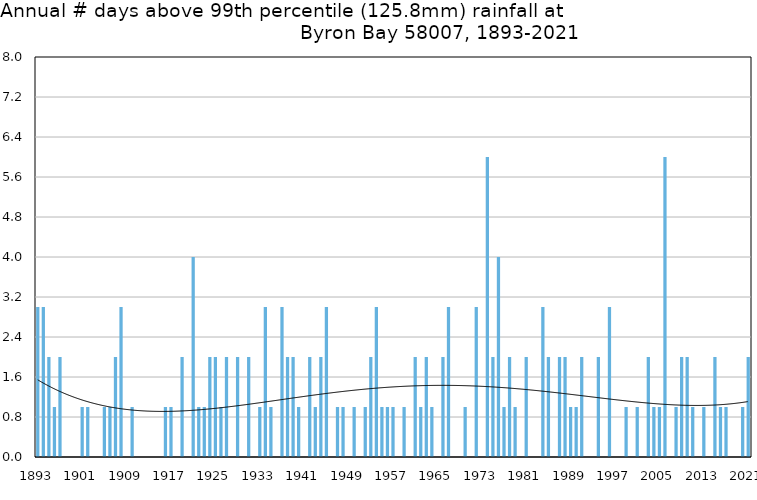
| Category | Annual # days above 99th percentile |
|---|---|
| 1893 | 3 |
| 1894 | 3 |
| 1895 | 2 |
| 1896 | 1 |
| 1897 | 2 |
| 1898 | 0 |
| 1899 | 0 |
| 1900 | 0 |
| 1901 | 1 |
| 1902 | 1 |
| 1903 | 0 |
| 1904 | 0 |
| 1905 | 1 |
| 1906 | 1 |
| 1907 | 2 |
| 1908 | 3 |
| 1909 | 0 |
| 1910 | 1 |
| 1911 | 0 |
| 1912 | 0 |
| 1913 | 0 |
| 1914 | 0 |
| 1915 | 0 |
| 1916 | 1 |
| 1917 | 1 |
| 1918 | 0 |
| 1919 | 2 |
| 1920 | 0 |
| 1921 | 4 |
| 1922 | 1 |
| 1923 | 1 |
| 1924 | 2 |
| 1925 | 2 |
| 1926 | 1 |
| 1927 | 2 |
| 1928 | 0 |
| 1929 | 2 |
| 1930 | 0 |
| 1931 | 2 |
| 1932 | 0 |
| 1933 | 1 |
| 1934 | 3 |
| 1935 | 1 |
| 1936 | 0 |
| 1937 | 3 |
| 1938 | 2 |
| 1939 | 2 |
| 1940 | 1 |
| 1941 | 0 |
| 1942 | 2 |
| 1943 | 1 |
| 1944 | 2 |
| 1945 | 3 |
| 1946 | 0 |
| 1947 | 1 |
| 1948 | 1 |
| 1949 | 0 |
| 1950 | 1 |
| 1951 | 0 |
| 1952 | 1 |
| 1953 | 2 |
| 1954 | 3 |
| 1955 | 1 |
| 1956 | 1 |
| 1957 | 1 |
| 1958 | 0 |
| 1959 | 1 |
| 1960 | 0 |
| 1961 | 2 |
| 1962 | 1 |
| 1963 | 2 |
| 1964 | 1 |
| 1965 | 0 |
| 1966 | 2 |
| 1967 | 3 |
| 1968 | 0 |
| 1969 | 0 |
| 1970 | 1 |
| 1971 | 0 |
| 1972 | 3 |
| 1973 | 0 |
| 1974 | 6 |
| 1975 | 2 |
| 1976 | 4 |
| 1977 | 1 |
| 1978 | 2 |
| 1979 | 1 |
| 1980 | 0 |
| 1981 | 2 |
| 1982 | 0 |
| 1983 | 0 |
| 1984 | 3 |
| 1985 | 2 |
| 1986 | 0 |
| 1987 | 2 |
| 1988 | 2 |
| 1989 | 1 |
| 1990 | 1 |
| 1991 | 2 |
| 1992 | 0 |
| 1993 | 0 |
| 1994 | 2 |
| 1995 | 0 |
| 1996 | 3 |
| 1997 | 0 |
| 1998 | 0 |
| 1999 | 1 |
| 2000 | 0 |
| 2001 | 1 |
| 2002 | 0 |
| 2003 | 2 |
| 2004 | 1 |
| 2005 | 1 |
| 2006 | 6 |
| 2007 | 0 |
| 2008 | 1 |
| 2009 | 2 |
| 2010 | 2 |
| 2011 | 1 |
| 2012 | 0 |
| 2013 | 1 |
| 2014 | 0 |
| 2015 | 2 |
| 2016 | 1 |
| 2017 | 1 |
| 2018 | 0 |
| 2019 | 0 |
| 2020 | 1 |
| 2021 | 2 |